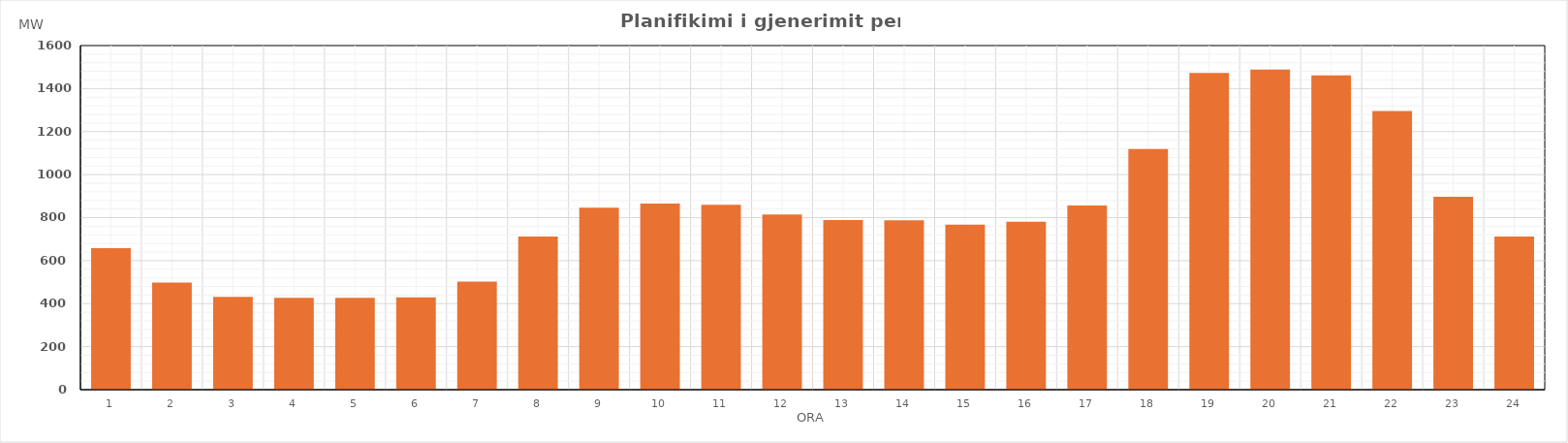
| Category | Max (MW) |
|---|---|
| 0 | 657.81 |
| 1 | 498.07 |
| 2 | 431.26 |
| 3 | 426.66 |
| 4 | 427.14 |
| 5 | 428.75 |
| 6 | 502.59 |
| 7 | 712.33 |
| 8 | 845.89 |
| 9 | 865.19 |
| 10 | 859.22 |
| 11 | 814.16 |
| 12 | 788.29 |
| 13 | 787.28 |
| 14 | 767.27 |
| 15 | 781.15 |
| 16 | 856.37 |
| 17 | 1119.39 |
| 18 | 1473.11 |
| 19 | 1488.01 |
| 20 | 1461.02 |
| 21 | 1295.4 |
| 22 | 896.71 |
| 23 | 712.28 |